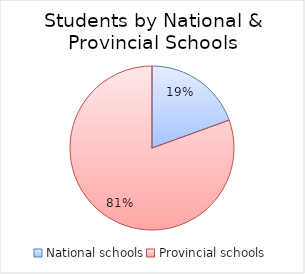
| Category | Series 0 |
|---|---|
| National schools | 811164 |
| Provincial schools | 3354791 |